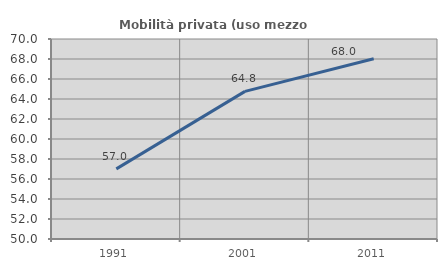
| Category | Mobilità privata (uso mezzo privato) |
|---|---|
| 1991.0 | 57.012 |
| 2001.0 | 64.76 |
| 2011.0 | 68.02 |